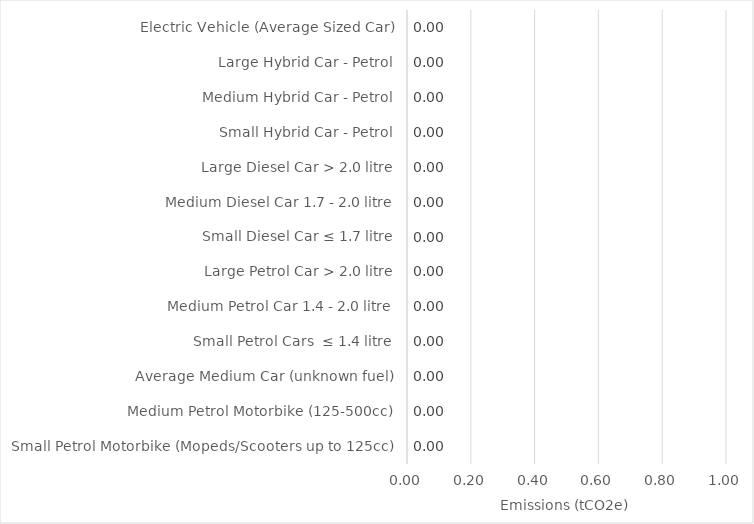
| Category | Series 0 |
|---|---|
| Small Petrol Motorbike (Mopeds/Scooters up to 125cc) | 0 |
| Medium Petrol Motorbike (125-500cc) | 0 |
| Average Medium Car (unknown fuel) | 0 |
| Small Petrol Cars  ≤ 1.4 litre | 0 |
| Medium Petrol Car 1.4 - 2.0 litre | 0 |
| Large Petrol Car > 2.0 litre | 0 |
| Small Diesel Car ≤ 1.7 litre | 0 |
| Medium Diesel Car 1.7 - 2.0 litre | 0 |
| Large Diesel Car > 2.0 litre | 0 |
| Small Hybrid Car - Petrol | 0 |
| Medium Hybrid Car - Petrol | 0 |
| Large Hybrid Car - Petrol | 0 |
| Electric Vehicle (Average Sized Car) | 0 |